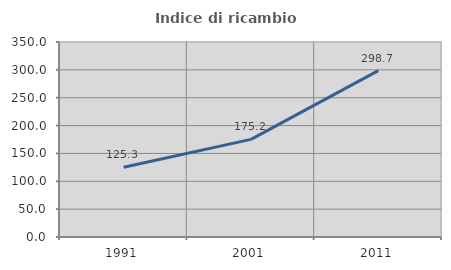
| Category | Indice di ricambio occupazionale  |
|---|---|
| 1991.0 | 125.309 |
| 2001.0 | 175.186 |
| 2011.0 | 298.671 |